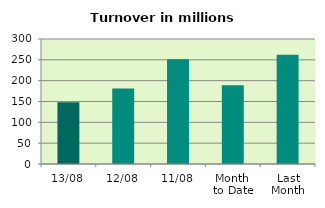
| Category | Series 0 |
|---|---|
| 13/08 | 147.93 |
| 12/08 | 181.239 |
| 11/08 | 251.576 |
| Month 
to Date | 188.843 |
| Last
Month | 262.308 |